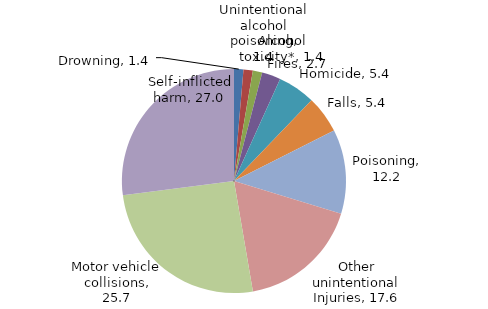
| Category | Total |
|---|---|
| Drowning | 1.351 |
| Unintentional alcohol poisoning | 1.351 |
| Alcohol toxicity* | 1.351 |
| Fires | 2.703 |
| Homicide | 5.405 |
| Falls | 5.405 |
| Poisoning | 12.162 |
| Other unintentional Injuries | 17.568 |
| Motor vehicle collisions | 25.676 |
| Self-inflicted harm | 27.027 |